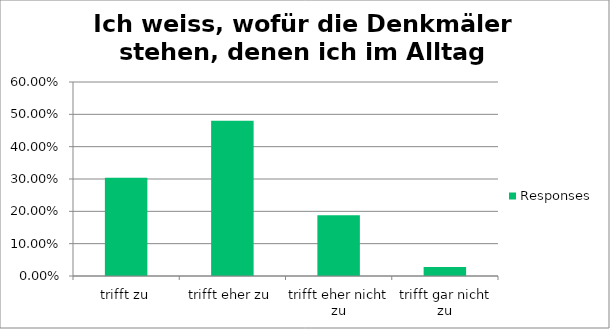
| Category | Responses |
|---|---|
| trifft zu | 0.304 |
| trifft eher zu | 0.48 |
| trifft eher nicht zu | 0.188 |
| trifft gar nicht zu | 0.028 |